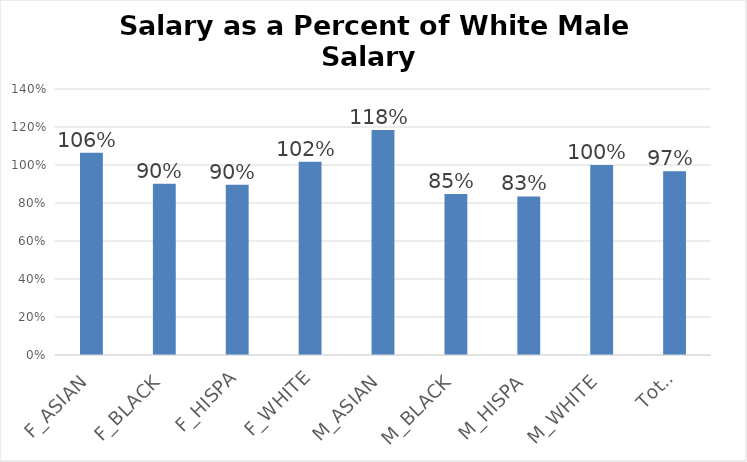
| Category | Salary as a Percent of White Male Salary |
|---|---|
| F_ASIAN | 1.064 |
| F_BLACK | 0.901 |
| F_HISPA | 0.897 |
| F_WHITE | 1.017 |
| M_ASIAN | 1.185 |
| M_BLACK | 0.847 |
| M_HISPA | 0.835 |
| M_WHITE | 1 |
| Total | 0.967 |